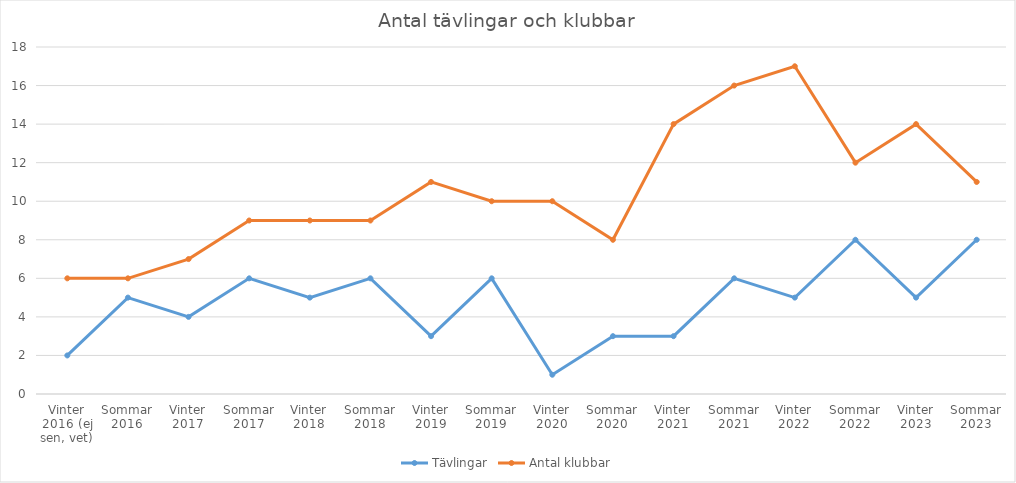
| Category | Tävlingar | Antal klubbar |
|---|---|---|
| Vinter 2016 (ej sen, vet) | 2 | 6 |
| Sommar 2016 | 5 | 6 |
| Vinter 2017 | 4 | 7 |
| Sommar 2017 | 6 | 9 |
| Vinter 2018 | 5 | 9 |
| Sommar 2018 | 6 | 9 |
| Vinter 2019 | 3 | 11 |
| Sommar 2019 | 6 | 10 |
| Vinter 2020 | 1 | 10 |
| Sommar 2020 | 3 | 8 |
| Vinter 2021 | 3 | 14 |
| Sommar 2021 | 6 | 16 |
| Vinter 2022 | 5 | 17 |
| Sommar 2022 | 8 | 12 |
| Vinter 2023 | 5 | 14 |
| Sommar 2023 | 8 | 11 |